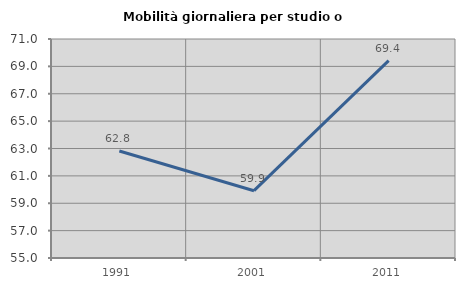
| Category | Mobilità giornaliera per studio o lavoro |
|---|---|
| 1991.0 | 62.821 |
| 2001.0 | 59.917 |
| 2011.0 | 69.418 |